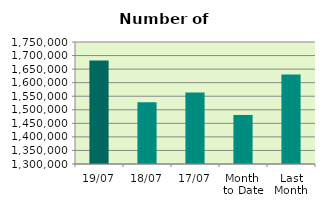
| Category | Series 0 |
|---|---|
| 19/07 | 1681574 |
| 18/07 | 1527470 |
| 17/07 | 1563610 |
| Month 
to Date | 1480884.4 |
| Last
Month | 1630183.4 |